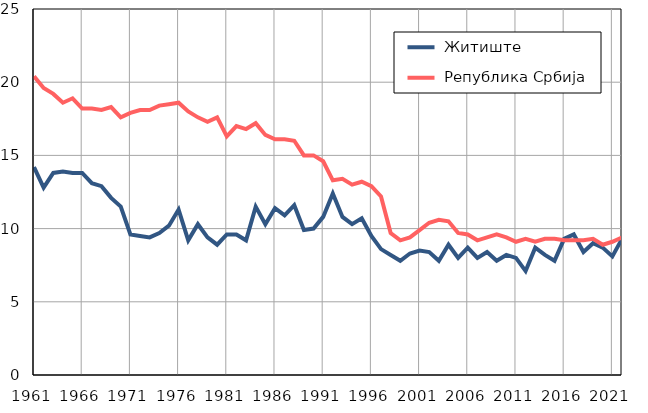
| Category |  Житиште |  Република Србија |
|---|---|---|
| 1961.0 | 14.2 | 20.4 |
| 1962.0 | 12.8 | 19.6 |
| 1963.0 | 13.8 | 19.2 |
| 1964.0 | 13.9 | 18.6 |
| 1965.0 | 13.8 | 18.9 |
| 1966.0 | 13.8 | 18.2 |
| 1967.0 | 13.1 | 18.2 |
| 1968.0 | 12.9 | 18.1 |
| 1969.0 | 12.1 | 18.3 |
| 1970.0 | 11.5 | 17.6 |
| 1971.0 | 9.6 | 17.9 |
| 1972.0 | 9.5 | 18.1 |
| 1973.0 | 9.4 | 18.1 |
| 1974.0 | 9.7 | 18.4 |
| 1975.0 | 10.2 | 18.5 |
| 1976.0 | 11.3 | 18.6 |
| 1977.0 | 9.2 | 18 |
| 1978.0 | 10.3 | 17.6 |
| 1979.0 | 9.4 | 17.3 |
| 1980.0 | 8.9 | 17.6 |
| 1981.0 | 9.6 | 16.3 |
| 1982.0 | 9.6 | 17 |
| 1983.0 | 9.2 | 16.8 |
| 1984.0 | 11.5 | 17.2 |
| 1985.0 | 10.3 | 16.4 |
| 1986.0 | 11.4 | 16.1 |
| 1987.0 | 10.9 | 16.1 |
| 1988.0 | 11.6 | 16 |
| 1989.0 | 9.9 | 15 |
| 1990.0 | 10 | 15 |
| 1991.0 | 10.8 | 14.6 |
| 1992.0 | 12.4 | 13.3 |
| 1993.0 | 10.8 | 13.4 |
| 1994.0 | 10.3 | 13 |
| 1995.0 | 10.7 | 13.2 |
| 1996.0 | 9.5 | 12.9 |
| 1997.0 | 8.6 | 12.2 |
| 1998.0 | 8.2 | 9.7 |
| 1999.0 | 7.8 | 9.2 |
| 2000.0 | 8.3 | 9.4 |
| 2001.0 | 8.5 | 9.9 |
| 2002.0 | 8.4 | 10.4 |
| 2003.0 | 7.8 | 10.6 |
| 2004.0 | 8.9 | 10.5 |
| 2005.0 | 8 | 9.7 |
| 2006.0 | 8.7 | 9.6 |
| 2007.0 | 8 | 9.2 |
| 2008.0 | 8.4 | 9.4 |
| 2009.0 | 7.8 | 9.6 |
| 2010.0 | 8.2 | 9.4 |
| 2011.0 | 8 | 9.1 |
| 2012.0 | 7.1 | 9.3 |
| 2013.0 | 8.7 | 9.1 |
| 2014.0 | 8.2 | 9.3 |
| 2015.0 | 7.8 | 9.3 |
| 2016.0 | 9.3 | 9.2 |
| 2017.0 | 9.6 | 9.2 |
| 2018.0 | 8.4 | 9.2 |
| 2019.0 | 9 | 9.3 |
| 2020.0 | 8.7 | 8.9 |
| 2021.0 | 8.1 | 9.1 |
| 2022.0 | 9.3 | 9.4 |